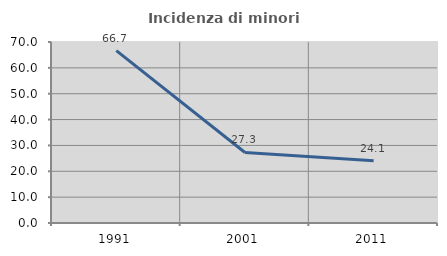
| Category | Incidenza di minori stranieri |
|---|---|
| 1991.0 | 66.667 |
| 2001.0 | 27.273 |
| 2011.0 | 24.074 |